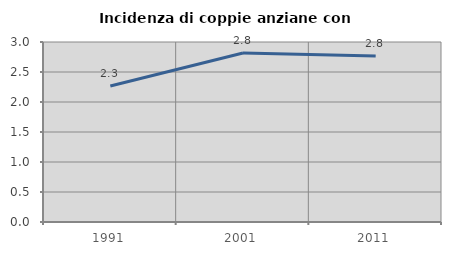
| Category | Incidenza di coppie anziane con figli |
|---|---|
| 1991.0 | 2.267 |
| 2001.0 | 2.815 |
| 2011.0 | 2.767 |